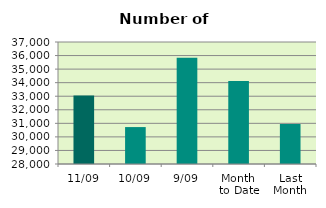
| Category | Series 0 |
|---|---|
| 11/09 | 33054 |
| 10/09 | 30724 |
| 9/09 | 35838 |
| Month 
to Date | 34128 |
| Last
Month | 30949.143 |